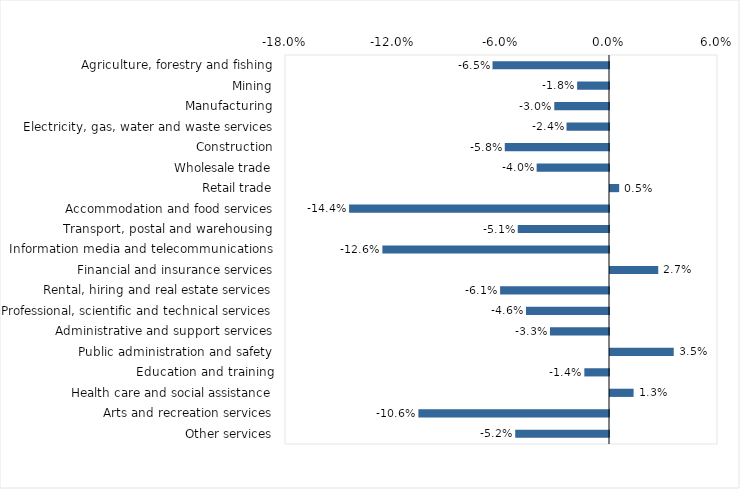
| Category | This week |
|---|---|
| Agriculture, forestry and fishing | -0.065 |
| Mining | -0.018 |
| Manufacturing | -0.03 |
| Electricity, gas, water and waste services | -0.024 |
| Construction | -0.058 |
| Wholesale trade | -0.04 |
| Retail trade | 0.005 |
| Accommodation and food services | -0.144 |
| Transport, postal and warehousing | -0.051 |
| Information media and telecommunications | -0.126 |
| Financial and insurance services | 0.027 |
| Rental, hiring and real estate services | -0.06 |
| Professional, scientific and technical services | -0.046 |
| Administrative and support services | -0.033 |
| Public administration and safety | 0.035 |
| Education and training | -0.014 |
| Health care and social assistance | 0.013 |
| Arts and recreation services | -0.106 |
| Other services | -0.052 |